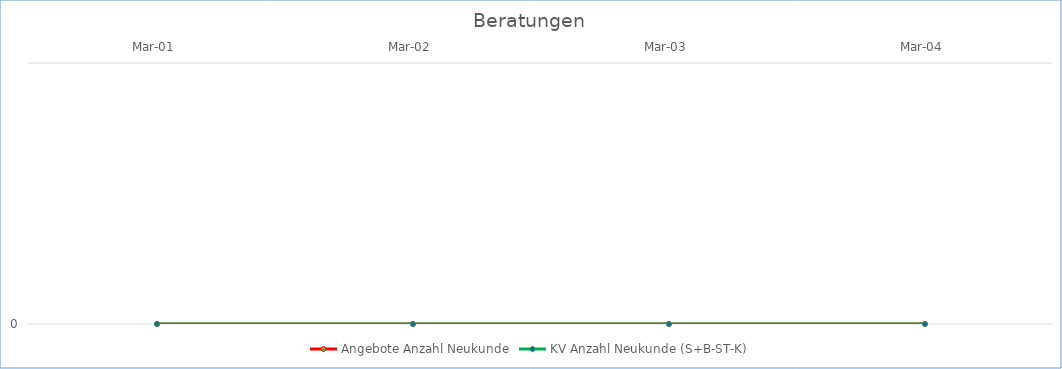
| Category | Angebote Anzahl Neukunde | KV Anzahl Neukunde (S+B-ST-K) |
|---|---|---|
| 2001-03-01 | 0 | 0 |
| 2002-03-01 | 0 | 0 |
| 2003-03-01 | 0 | 0 |
| 2004-03-01 | 0 | 0 |